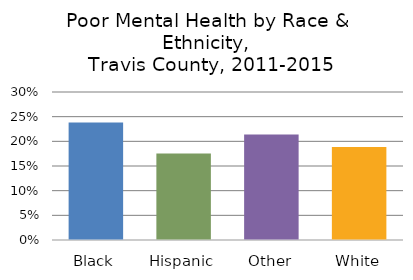
| Category | Series 0 |
|---|---|
| Black | 0.238 |
| Hispanic | 0.176 |
| Other | 0.214 |
| White | 0.188 |